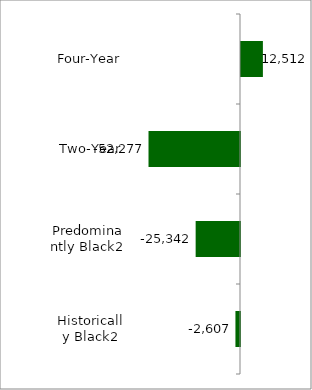
| Category | State |
|---|---|
| Four-Year | 12512 |
| Two-Year | -52277 |
| Predominantly Black2 | -25342 |
| Historically Black2 | -2607 |